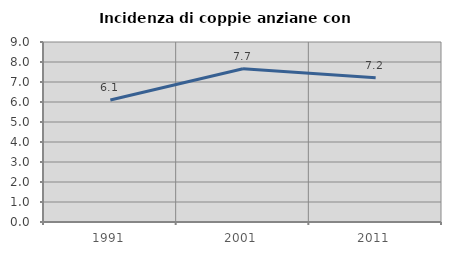
| Category | Incidenza di coppie anziane con figli |
|---|---|
| 1991.0 | 6.098 |
| 2001.0 | 7.661 |
| 2011.0 | 7.207 |